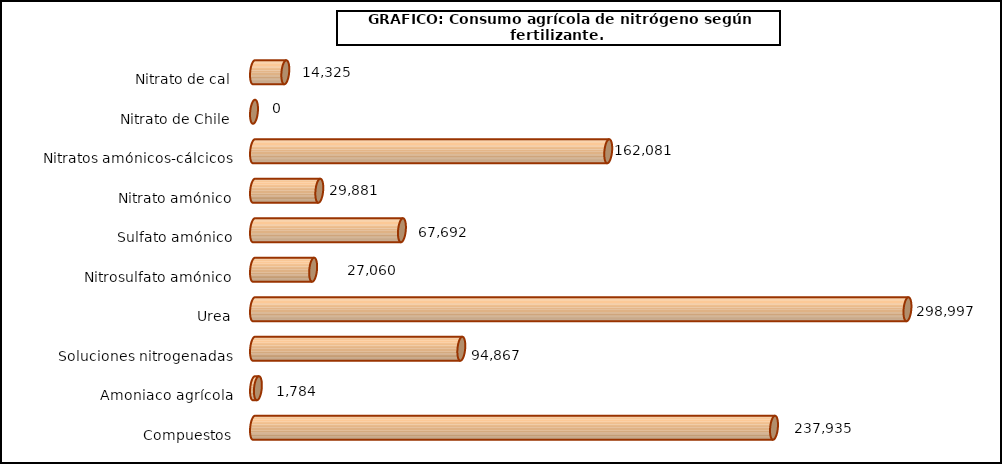
| Category | fert. N |
|---|---|
| 0 | 14325 |
| 1 | 0 |
| 2 | 162081 |
| 3 | 29881 |
| 4 | 67692 |
| 5 | 27060 |
| 6 | 298997 |
| 7 | 94867 |
| 8 | 1784 |
| 9 | 237935 |